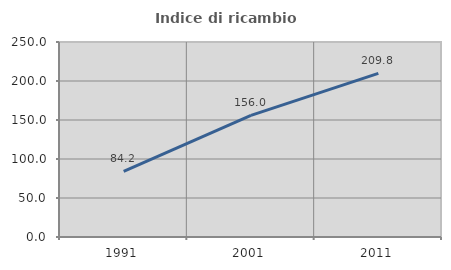
| Category | Indice di ricambio occupazionale  |
|---|---|
| 1991.0 | 84.196 |
| 2001.0 | 156 |
| 2011.0 | 209.774 |